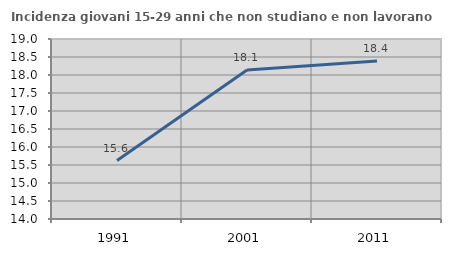
| Category | Incidenza giovani 15-29 anni che non studiano e non lavorano  |
|---|---|
| 1991.0 | 15.625 |
| 2001.0 | 18.137 |
| 2011.0 | 18.391 |